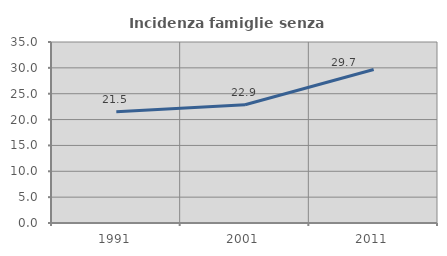
| Category | Incidenza famiglie senza nuclei |
|---|---|
| 1991.0 | 21.513 |
| 2001.0 | 22.873 |
| 2011.0 | 29.672 |